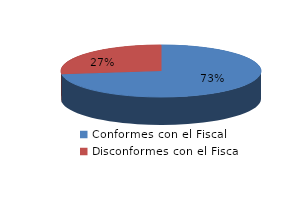
| Category | Series 0 |
|---|---|
| 0 | 1729 |
| 1 | 641 |